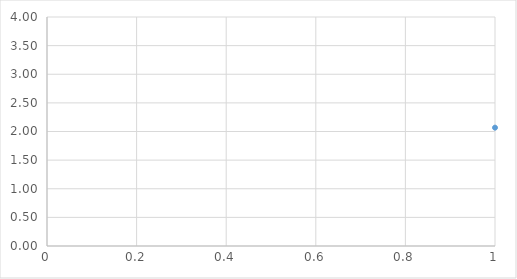
| Category | Series 0 |
|---|---|
| 0 | 2.067 |
| 1 | 2.671 |
| 2 | 3.453 |
| 3 | 2.031 |
| 4 | 1.987 |
| 5 | 2.622 |
| 6 | 2.648 |
| 7 | 3.359 |
| 8 | 3.246 |